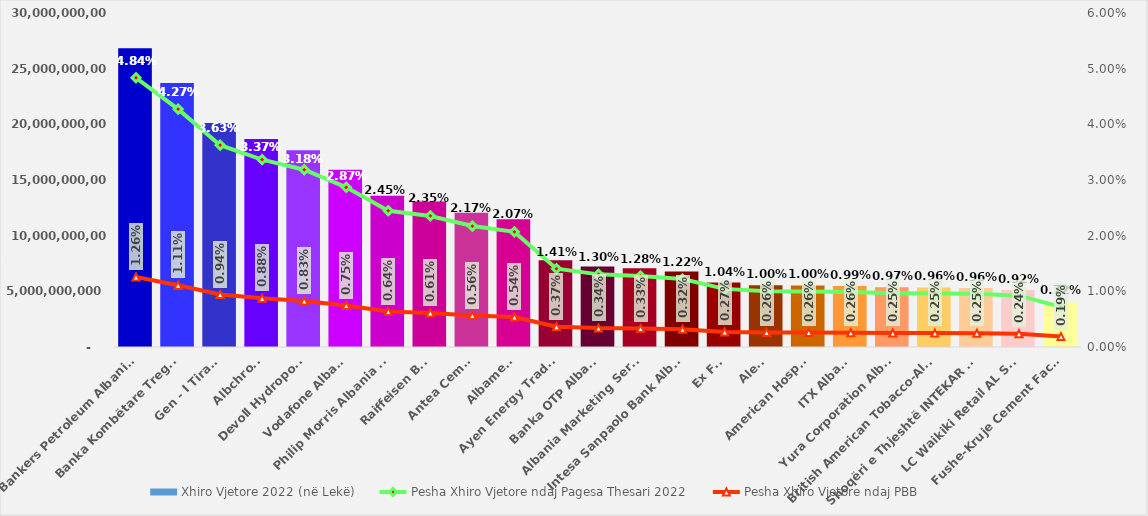
| Category | Xhiro Vjetore 2022 (në Lekë) |
|---|---|
| Bankers Petroleum Albania Ltd | 26829000000 |
| Banka Kombëtare Tregtare | 23706242000 |
| Gen - I Tirana | 20114011888 |
| Albchrome | 18680000000 |
| Devoll Hydropower | 17666392290 |
| Vodafone Albania | 15911000000 |
| Philip Morris Albania shpk | 13584176000 |
| Raiffeisen Bank | 13062458000 |
| Antea Cement | 12056748000 |
| Albametal | 11474876424 |
| Ayen Energy Trading | 7802423415 |
| Banka OTP Albania | 7239471000 |
| Albania Marketing Service | 7074191064 |
| Intesa Sanpaolo Bank Albania | 6777726000 |
| Ex Fis | 5792772756 |
| Aleat | 5554972201 |
| American Hospital | 5533331000 |
| ITX Albania | 5482171000 |
| Yura Corporation Albania | 5365678864 |
| British American Tobacco-Albania | 5335626498 |
| Shoqëri e Thjeshtë INTEKAR - ASL | 5299351725 |
| LC Waikiki Retail AL Sh.p.k | 5115555822 |
| Fushe-Kruje Cement Factory | 4000000000 |